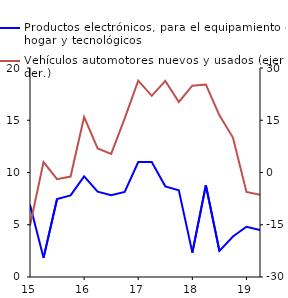
| Category | Productos electrónicos, para el equipamiento del hogar y tecnológicos |
|---|---|
| 2015-03-01 | 6.915 |
| 2015-06-01 | 1.831 |
| 2015-09-01 | 7.467 |
| 2015-12-01 | 7.811 |
| 2016-03-01 | 9.636 |
| 2016-06-01 | 8.17 |
| 2016-09-01 | 7.818 |
| 2016-12-01 | 8.148 |
| 2017-03-01 | 11.008 |
| 2017-06-01 | 10.998 |
| 2017-09-01 | 8.674 |
| 2017-12-01 | 8.308 |
| 2018-03-01 | 2.332 |
| 2018-06-01 | 8.787 |
| 2018-09-01 | 2.497 |
| 2018-12-01 | 3.875 |
| 2019-03-01 | 4.807 |
| 2019-06-02 | 4.487 |